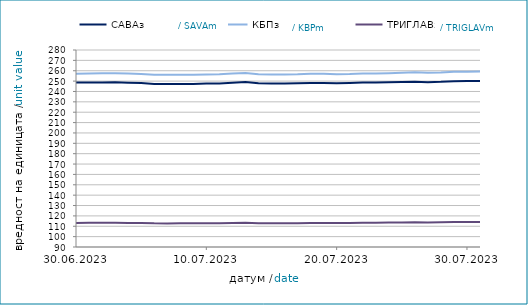
| Category | САВАз | КБПз | ТРИГЛАВз |
|---|---|---|---|
| 2023-06-30 | 248.544 | 257.199 | 113.135 |
| 2023-07-01 | 248.723 | 257.444 | 113.288 |
| 2023-07-02 | 248.737 | 257.459 | 113.295 |
| 2023-07-03 | 248.902 | 257.591 | 113.375 |
| 2023-07-04 | 248.505 | 257.254 | 113.265 |
| 2023-07-05 | 248.186 | 256.918 | 113.12 |
| 2023-07-06 | 247.256 | 256.059 | 112.795 |
| 2023-07-07 | 247.183 | 256.056 | 112.758 |
| 2023-07-08 | 247.263 | 256.145 | 112.796 |
| 2023-07-09 | 247.278 | 256.159 | 112.804 |
| 2023-07-10 | 247.606 | 256.372 | 112.914 |
| 2023-07-11 | 247.762 | 256.526 | 112.99 |
| 2023-07-12 | 248.315 | 257.216 | 113.239 |
| 2023-07-13 | 249.106 | 257.902 | 113.478 |
| 2023-07-14 | 247.955 | 256.69 | 112.963 |
| 2023-07-15 | 247.741 | 256.449 | 112.863 |
| 2023-07-16 | 247.756 | 256.463 | 112.87 |
| 2023-07-17 | 247.934 | 256.588 | 112.939 |
| 2023-07-18 | 248.257 | 257.03 | 113.145 |
| 2023-07-19 | 248.239 | 257.004 | 113.153 |
| 2023-07-20 | 247.922 | 256.723 | 113.099 |
| 2023-07-21 | 248.163 | 256.934 | 113.198 |
| 2023-07-22 | 248.6 | 257.427 | 113.409 |
| 2023-07-23 | 248.614 | 257.441 | 113.416 |
| 2023-07-24 | 248.804 | 257.639 | 113.514 |
| 2023-07-25 | 249.101 | 258.099 | 113.676 |
| 2023-07-26 | 249.402 | 258.456 | 113.836 |
| 2023-07-27 | 248.972 | 258.065 | 113.646 |
| 2023-07-28 | 249.295 | 258.344 | 113.753 |
| 2023-07-29 | 249.977 | 259.119 | 114.086 |
| 2023-07-30 | 249.991 | 259.134 | 114.093 |
| 2023-07-31 | 250.219 | 259.267 | 114.154 |